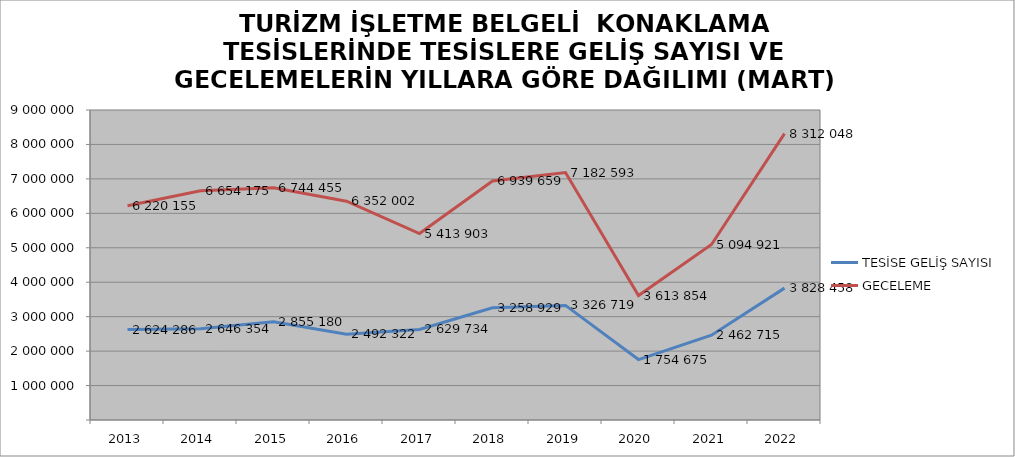
| Category | TESİSE GELİŞ SAYISI | GECELEME |
|---|---|---|
| 2013 | 2624286 | 6220155 |
| 2014 | 2646354 | 6654175 |
| 2015 | 2855180 | 6744455 |
| 2016 | 2492322 | 6352002 |
| 2017 | 2629734 | 5413903 |
| 2018 | 3258929 | 6939659 |
| 2019 | 3326719 | 7182593 |
| 2020 | 1754675 | 3613854 |
| 2021 | 2462715 | 5094921 |
| 2022 | 3828458 | 8312048 |